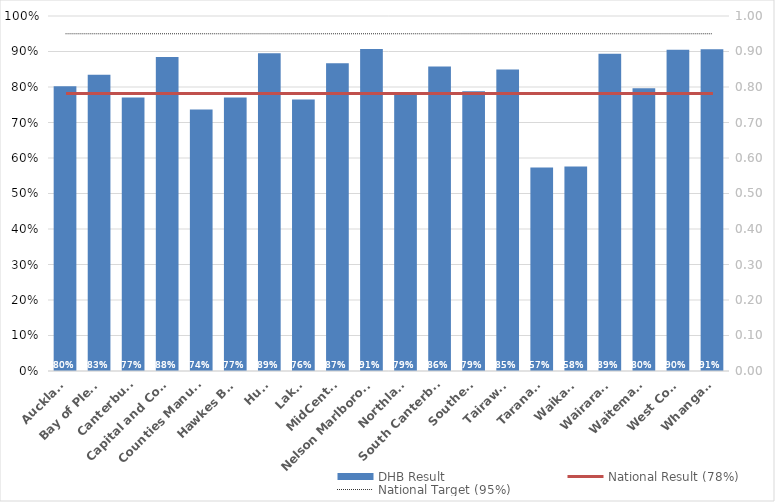
| Category | DHB Result |
|---|---|
| Auckland | 0.802 |
| Bay of Plenty | 0.835 |
| Canterbury | 0.77 |
| Capital and Coast | 0.885 |
| Counties Manukau | 0.737 |
| Hawkes Bay | 0.77 |
| Hutt | 0.895 |
| Lakes | 0.765 |
| MidCentral | 0.867 |
| Nelson Marlborough | 0.907 |
| Northland | 0.785 |
| South Canterbury | 0.858 |
| Southern | 0.788 |
| Tairawhiti | 0.85 |
| Taranaki | 0.573 |
| Waikato | 0.576 |
| Wairarapa | 0.894 |
| Waitemata | 0.796 |
| West Coast | 0.905 |
| Whanganui | 0.906 |